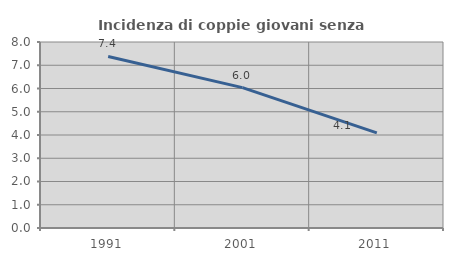
| Category | Incidenza di coppie giovani senza figli |
|---|---|
| 1991.0 | 7.378 |
| 2001.0 | 6.038 |
| 2011.0 | 4.092 |